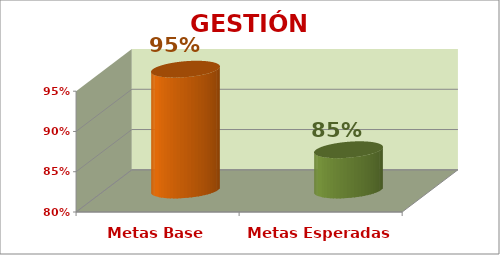
| Category | GESTIÓN ESTRATÉGICA |
|---|---|
| Metas Base | 0.95 |
| Metas Esperadas | 0.85 |